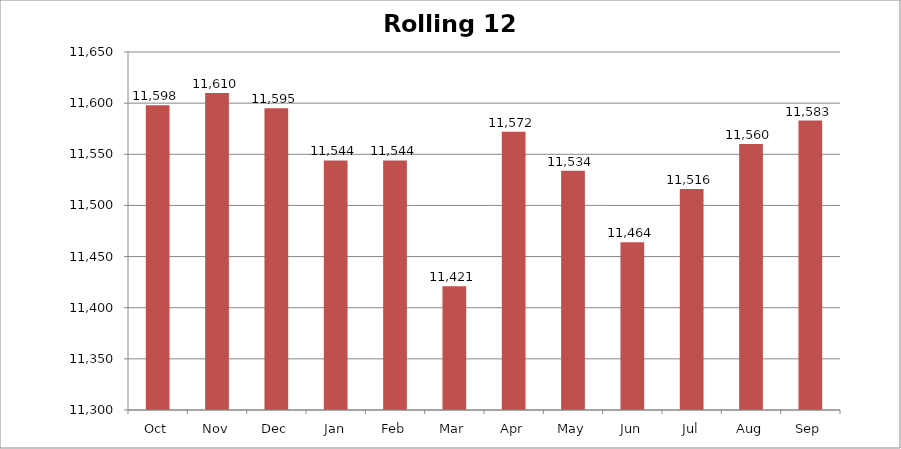
| Category | Rolling 12 Month |
|---|---|
| Oct | 11598 |
| Nov | 11610 |
| Dec | 11595 |
| Jan | 11544 |
| Feb | 11544 |
| Mar | 11421 |
| Apr | 11572 |
| May | 11534 |
| Jun | 11464 |
| Jul | 11516 |
| Aug | 11560 |
| Sep | 11583 |